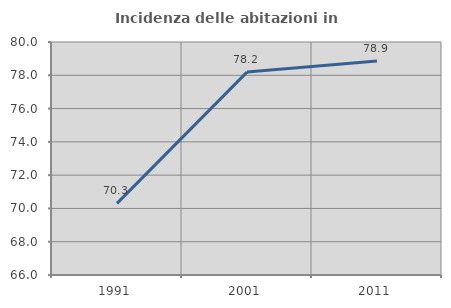
| Category | Incidenza delle abitazioni in proprietà  |
|---|---|
| 1991.0 | 70.304 |
| 2001.0 | 78.192 |
| 2011.0 | 78.863 |